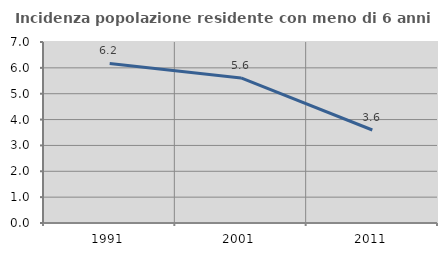
| Category | Incidenza popolazione residente con meno di 6 anni |
|---|---|
| 1991.0 | 6.173 |
| 2001.0 | 5.611 |
| 2011.0 | 3.597 |